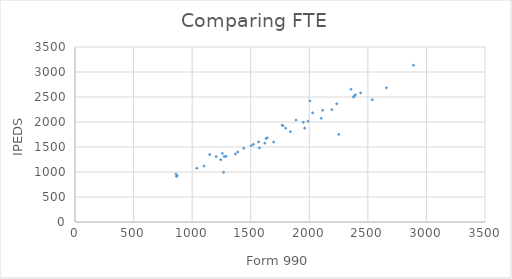
| Category | Series 0 |
|---|---|
| 2251.8238773274916 | 1752 |
| 1268.2640681239575 | 993 |
| 1574.7250344827587 | 1482 |
| 1695.6630524426332 | 1600 |
| 1960.627712673611 | 1878 |
| 2537.7978701190227 | 2446 |
| 1620.4467416245984 | 1577 |
| 1839.083747744576 | 1807 |
| 2101.387723785166 | 2075 |
| 1368.2325559276335 | 1360 |
| 1243.9908422489323 | 1245 |
| 1389.3028856027931 | 1399 |
| 2658.2672552866798 | 2684 |
| 1989.6258482418261 | 2015 |
| 1503.7651532349603 | 1524 |
| 1102.092670875652 | 1118 |
| 1290.4247316301905 | 1312 |
| 1523.3463035019456 | 1554 |
| 1567.2849090500786 | 1602 |
| 1948.6899083761127 | 1994 |
| 1632.0997914540533 | 1671 |
| 2192.429881372235 | 2246 |
| 1440.8931558935362 | 1477 |
| 1639.8776800439803 | 1683 |
| 1274.170243902439 | 1309 |
| 1039.7128667808952 | 1076 |
| 1799.0342900964067 | 1876 |
| 2377.0194016521546 | 2497 |
| 866.75301542777 | 911 |
| 2113.998770211797 | 2234 |
| 2383.9524684022904 | 2520 |
| 2234.4719734251967 | 2365 |
| 2438.1514215357065 | 2583 |
| 2393.979910617434 | 2544 |
| 872.2778256870185 | 929 |
| 2028.9574136276392 | 2183 |
| 1886.4947552447552 | 2039 |
| 1775.6153235781464 | 1924 |
| 2889.361944344055 | 3134 |
| 1205.0141333333333 | 1310 |
| 1258.1527884786344 | 1372 |
| 1767.1939064714218 | 1939 |
| 861.9292811036578 | 959 |
| 2356.4907011985124 | 2656 |
| 1150.0637594458437 | 1350 |
| 2004.9637898839003 | 2422 |